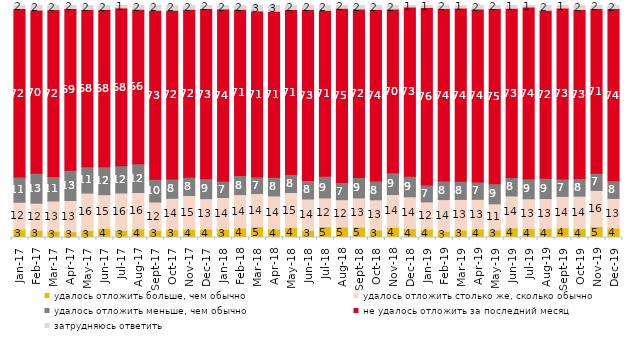
| Category | удалось отложить больше, чем обычно | удалось отложить столько же, сколько обычно | удалось отложить меньше, чем обычно | не удалось отложить за последний месяц | затрудняюсь ответить |
|---|---|---|---|---|---|
| 2017-01-01 | 3.45 | 11.75 | 10.9 | 72.2 | 1.7 |
| 2017-02-01 | 3.1 | 11.7 | 12.85 | 70.05 | 2.3 |
| 2017-03-01 | 2.7 | 13.05 | 10.55 | 71.5 | 2.2 |
| 2017-04-01 | 2.5 | 13.45 | 13 | 69.4 | 1.6 |
| 2017-05-01 | 3 | 16.15 | 11.35 | 67.5 | 2 |
| 2017-06-01 | 3.85 | 14.6 | 12 | 67.5 | 2.05 |
| 2017-07-01 | 3 | 16.2 | 11.75 | 67.7 | 1.35 |
| 2017-08-01 | 3.65 | 15.75 | 12.4 | 66.3 | 1.9 |
| 2017-09-01 | 3.05 | 12.25 | 9.8 | 72.55 | 2.35 |
| 2017-10-01 | 3.4 | 13.5 | 8.3 | 72.45 | 2.35 |
| 2017-11-01 | 3.55 | 14.55 | 7.85 | 72.05 | 1.95 |
| 2017-12-01 | 3.55 | 13.2 | 8.55 | 73.1 | 1.6 |
| 2018-01-01 | 3.45 | 13.8 | 7 | 73.9 | 1.85 |
| 2018-02-01 | 4.05 | 14.45 | 8.25 | 71.3 | 1.95 |
| 2018-03-01 | 4.6 | 14.35 | 7.1 | 71.3 | 2.65 |
| 2018-04-01 | 3.6 | 14.3 | 8.05 | 71.25 | 2.8 |
| 2018-05-01 | 4.3 | 15.1 | 7.75 | 70.75 | 2.1 |
| 2018-06-01 | 3.05 | 13.55 | 7.95 | 73.4 | 2.05 |
| 2018-07-01 | 4.65 | 12.4 | 9.35 | 71.2 | 2.4 |
| 2018-08-01 | 4.55 | 11.75 | 7.45 | 74.7 | 1.55 |
| 2018-09-01 | 4.5 | 12.55 | 8.8 | 72.3 | 1.85 |
| 2018-10-01 | 3.2 | 13.05 | 8.05 | 73.6 | 2.1 |
| 2018-11-01 | 4.341 | 14.172 | 9.381 | 70.259 | 1.846 |
| 2018-12-01 | 3.8 | 13.75 | 8.9 | 72.55 | 1 |
| 2019-01-01 | 3.55 | 11.8 | 7.25 | 76.1 | 1.3 |
| 2019-02-01 | 2.7 | 13.65 | 7.95 | 74.05 | 1.65 |
| 2019-03-01 | 3.182 | 13.227 | 7.857 | 74.291 | 1.442 |
| 2019-04-01 | 3.614 | 12.822 | 7.475 | 74.257 | 1.832 |
| 2019-05-01 | 3.219 | 11.293 | 8.618 | 75.285 | 1.585 |
| 2019-06-01 | 4.14 | 13.766 | 7.93 | 72.668 | 1.496 |
| 2019-07-01 | 3.812 | 12.871 | 8.663 | 73.663 | 0.99 |
| 2019-08-01 | 3.796 | 12.987 | 8.791 | 72.028 | 2.398 |
| 2019-09-01 | 4.158 | 13.564 | 7.475 | 73.366 | 1.436 |
| 2019-10-01 | 3.762 | 14.059 | 7.574 | 72.525 | 2.079 |
| 2019-11-01 | 4.703 | 15.594 | 7.376 | 70.743 | 1.584 |
| 2019-12-01 | 4.109 | 12.723 | 7.624 | 73.812 | 1.733 |